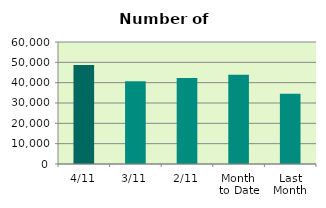
| Category | Series 0 |
|---|---|
| 4/11 | 48684 |
| 3/11 | 40698 |
| 2/11 | 42300 |
| Month 
to Date | 43894 |
| Last
Month | 34490.636 |